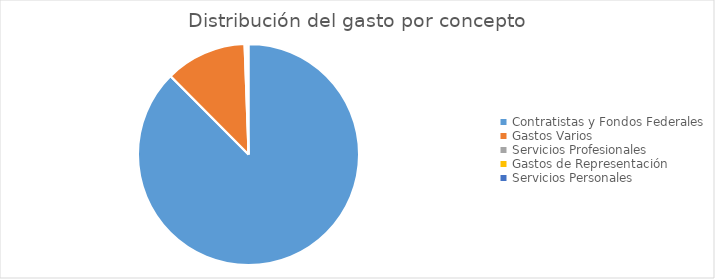
| Category | Series 0 |
|---|---|
| Contratistas y Fondos Federales | 7139740101 |
| Gastos Varios | 969083353 |
| Servicios Profesionales | 20795033.5 |
| Gastos de Representación | 1651224 |
| Servicios Personales | 24767765.5 |